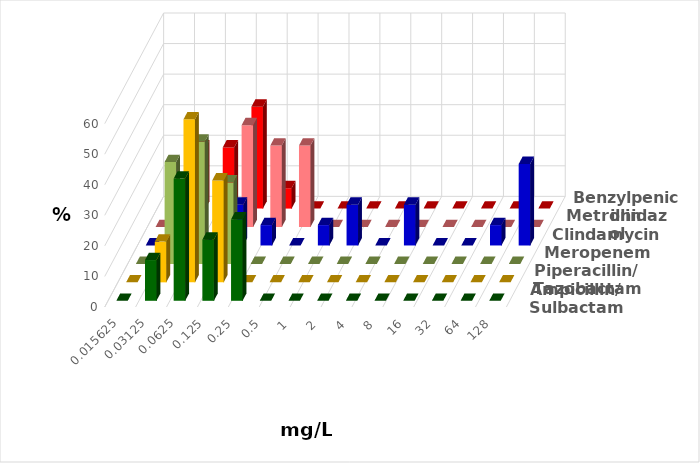
| Category | Ampicillin/ Sulbactam | Piperacillin/ Tazobactam | Meropenem | Clindamycin | Metronidazol | Benzylpenicillin |
|---|---|---|---|---|---|---|
| 0.015625 | 0 | 0 | 0 | 0 | 0 | 0 |
| 0.03125 | 13.333 | 13.333 | 33.333 | 13.333 | 13.333 | 20 |
| 0.0625 | 40 | 53.333 | 40 | 0 | 0 | 20 |
| 0.125 | 20 | 33.333 | 26.667 | 13.333 | 33.333 | 33.333 |
| 0.25 | 26.667 | 0 | 0 | 6.667 | 26.667 | 6.667 |
| 0.5 | 0 | 0 | 0 | 0 | 26.667 | 0 |
| 1.0 | 0 | 0 | 0 | 6.667 | 0 | 0 |
| 2.0 | 0 | 0 | 0 | 13.333 | 0 | 0 |
| 4.0 | 0 | 0 | 0 | 0 | 0 | 0 |
| 8.0 | 0 | 0 | 0 | 13.333 | 0 | 0 |
| 16.0 | 0 | 0 | 0 | 0 | 0 | 0 |
| 32.0 | 0 | 0 | 0 | 0 | 0 | 0 |
| 64.0 | 0 | 0 | 0 | 6.667 | 0 | 0 |
| 128.0 | 0 | 0 | 0 | 26.667 | 0 | 0 |